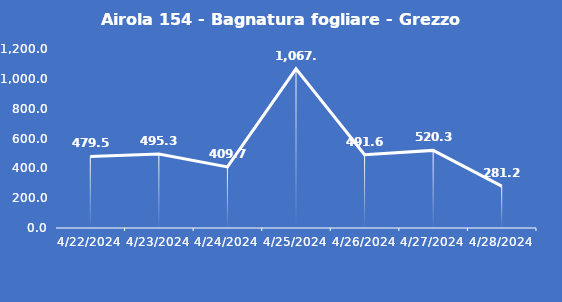
| Category | Airola 154 - Bagnatura fogliare - Grezzo (min) |
|---|---|
| 4/22/24 | 479.5 |
| 4/23/24 | 495.3 |
| 4/24/24 | 409.7 |
| 4/25/24 | 1067.1 |
| 4/26/24 | 491.6 |
| 4/27/24 | 520.3 |
| 4/28/24 | 281.2 |